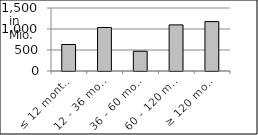
| Category | volume |
|---|---|
| ≤ 12 months | 631152764.06 |
| 12 - 36 months | 1035154372.7 |
| 36 - 60 months | 470131559.95 |
| 60 - 120 months | 1097971603.07 |
| ≥ 120 months | 1176706145.951 |